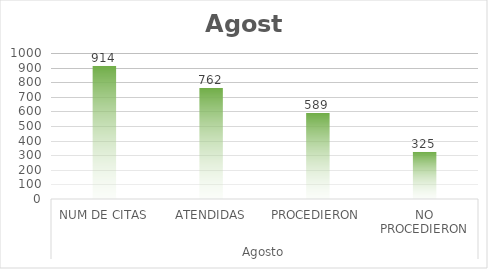
| Category | Series 0 |
|---|---|
| 0 | 914 |
| 1 | 762 |
| 2 | 589 |
| 3 | 325 |